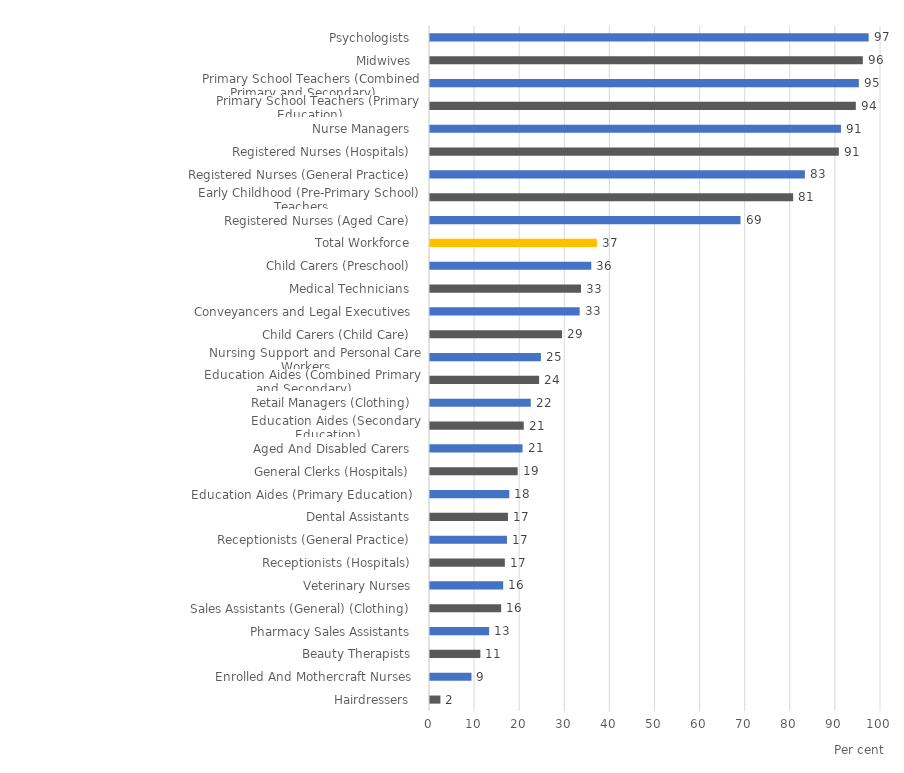
| Category |  % with Bachelor Degree  |
|---|---|
|  Hairdressers   | 2.307 |
|  Enrolled And Mothercraft Nurses   | 9.201 |
|  Beauty Therapists   | 11.169 |
|  Pharmacy Sales Assistants   | 13.11 |
|  Sales Assistants (General) (Clothing)   | 15.776 |
|   Veterinary Nurses   | 16.229 |
|   Receptionists (Hospitals)   | 16.591 |
|   Receptionists (General Practice)   | 17.067 |
|   Dental Assistants   | 17.288 |
|   Education Aides (Primary Education)   | 17.579 |
|   General Clerks (Hospitals)   | 19.437 |
|   Aged And Disabled Carers   | 20.513 |
|   Education Aides (Secondary Education)   | 20.79 |
|   Retail Managers (Clothing)   | 22.34 |
|   Education Aides (Combined Primary and Secondary)   | 24.192 |
|   Nursing Support and Personal Care Workers   | 24.597 |
|   Child Carers (Child Care)   | 29.281 |
|   Conveyancers and Legal Executives   | 33.181 |
|   Medical Technicians   | 33.485 |
|   Child Carers (Preschool)   | 35.765 |
|   Total Workforce   | 37.017 |
|   Registered Nurses (Aged Care)   | 68.852 |
|   Early Childhood (Pre-Primary School) Teachers   | 80.524 |
|   Registered Nurses (General Practice)   | 83.13 |
|   Registered Nurses (Hospitals)   | 90.644 |
|   Nurse Managers   | 91.131 |
|   Primary School Teachers (Primary Education)   | 94.419 |
|   Primary School Teachers (Combined Primary and Secondary)   | 95.093 |
|   Midwives   | 95.977 |
|   Psychologists   | 97.263 |